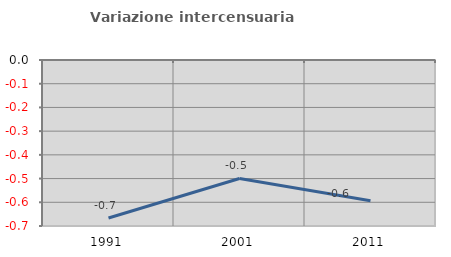
| Category | Variazione intercensuaria annua |
|---|---|
| 1991.0 | -0.666 |
| 2001.0 | -0.5 |
| 2011.0 | -0.594 |